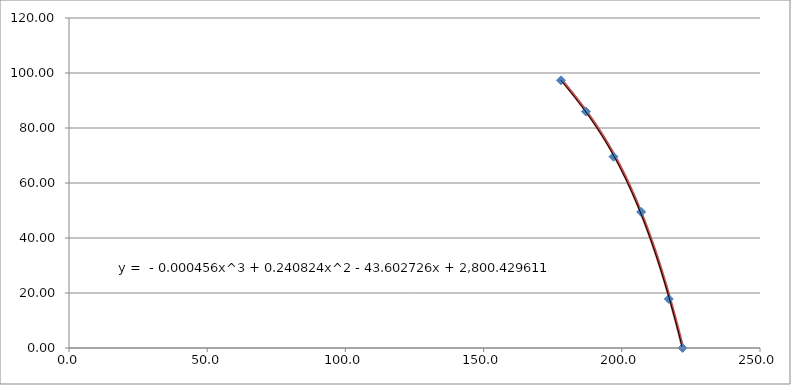
| Category | Series 1 |
|---|---|
| 178.0 | 97.685 |
| 179.0 | 96.469 |
| 180.0 | 95.245 |
| 181.0 | 94.009 |
| 182.0 | 92.761 |
| 183.0 | 91.496 |
| 184.0 | 90.212 |
| 185.0 | 88.906 |
| 186.0 | 87.575 |
| 187.0 | 86.218 |
| 188.0 | 84.83 |
| 189.0 | 83.41 |
| 190.0 | 81.954 |
| 191.0 | 80.46 |
| 192.0 | 78.925 |
| 193.0 | 77.347 |
| 194.0 | 75.722 |
| 195.0 | 74.048 |
| 196.0 | 72.322 |
| 197.0 | 70.541 |
| 198.0 | 68.703 |
| 199.0 | 66.805 |
| 200.0 | 64.844 |
| 201.0 | 62.818 |
| 202.0 | 60.723 |
| 203.0 | 58.558 |
| 204.0 | 56.318 |
| 205.0 | 54.002 |
| 206.0 | 51.607 |
| 207.0 | 49.13 |
| 208.0 | 46.568 |
| 209.0 | 43.919 |
| 210.0 | 41.18 |
| 211.0 | 38.347 |
| 212.0 | 35.419 |
| 213.0 | 32.393 |
| 214.0 | 29.265 |
| 215.0 | 26.034 |
| 216.0 | 22.696 |
| 217.0 | 19.249 |
| 218.0 | 15.689 |
| 219.0 | 12.015 |
| 220.0 | 8.223 |
| 221.0 | 4.312 |
| 222.0 | 0.277 |